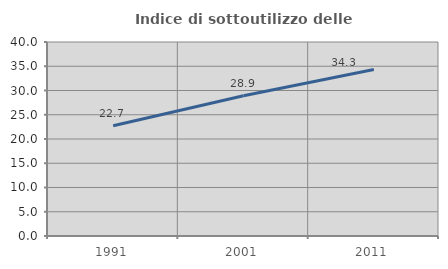
| Category | Indice di sottoutilizzo delle abitazioni  |
|---|---|
| 1991.0 | 22.747 |
| 2001.0 | 28.931 |
| 2011.0 | 34.337 |